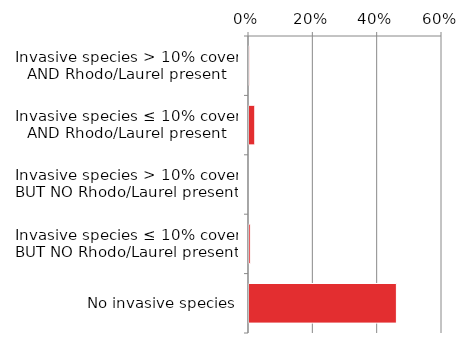
| Category | Non native |
|---|---|
| No invasive species | 0.461 |
| Invasive species ≤ 10% cover BUT NO Rhodo/Laurel present | 0.007 |
| Invasive species > 10% cover BUT NO Rhodo/Laurel present | 0 |
| Invasive species ≤ 10% cover AND Rhodo/Laurel present | 0.021 |
| Invasive species > 10% cover AND Rhodo/Laurel present | 0.005 |